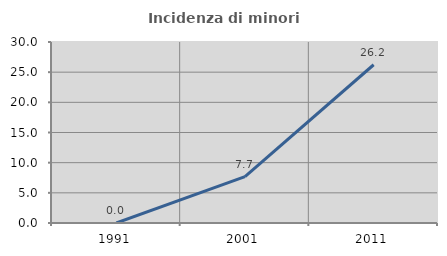
| Category | Incidenza di minori stranieri |
|---|---|
| 1991.0 | 0 |
| 2001.0 | 7.692 |
| 2011.0 | 26.23 |